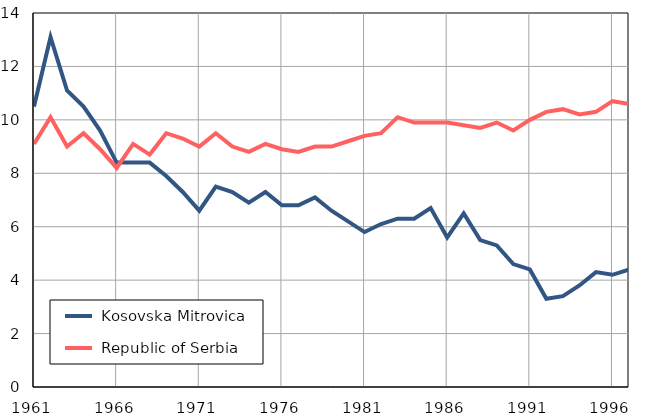
| Category |  Kosovska Mitrovica |  Republic of Serbia |
|---|---|---|
| 1961.0 | 10.5 | 9.1 |
| 1962.0 | 13.1 | 10.1 |
| 1963.0 | 11.1 | 9 |
| 1964.0 | 10.5 | 9.5 |
| 1965.0 | 9.6 | 8.9 |
| 1966.0 | 8.4 | 8.2 |
| 1967.0 | 8.4 | 9.1 |
| 1968.0 | 8.4 | 8.7 |
| 1969.0 | 7.9 | 9.5 |
| 1970.0 | 7.3 | 9.3 |
| 1971.0 | 6.6 | 9 |
| 1972.0 | 7.5 | 9.5 |
| 1973.0 | 7.3 | 9 |
| 1974.0 | 6.9 | 8.8 |
| 1975.0 | 7.3 | 9.1 |
| 1976.0 | 6.8 | 8.9 |
| 1977.0 | 6.8 | 8.8 |
| 1978.0 | 7.1 | 9 |
| 1979.0 | 6.6 | 9 |
| 1980.0 | 6.2 | 9.2 |
| 1981.0 | 5.8 | 9.4 |
| 1982.0 | 6.1 | 9.5 |
| 1983.0 | 6.3 | 10.1 |
| 1984.0 | 6.3 | 9.9 |
| 1985.0 | 6.7 | 9.9 |
| 1986.0 | 5.6 | 9.9 |
| 1987.0 | 6.5 | 9.8 |
| 1988.0 | 5.5 | 9.7 |
| 1989.0 | 5.3 | 9.9 |
| 1990.0 | 4.6 | 9.6 |
| 1991.0 | 4.4 | 10 |
| 1992.0 | 3.3 | 10.3 |
| 1993.0 | 3.4 | 10.4 |
| 1994.0 | 3.8 | 10.2 |
| 1995.0 | 4.3 | 10.3 |
| 1996.0 | 4.2 | 10.7 |
| 1997.0 | 4.4 | 10.6 |